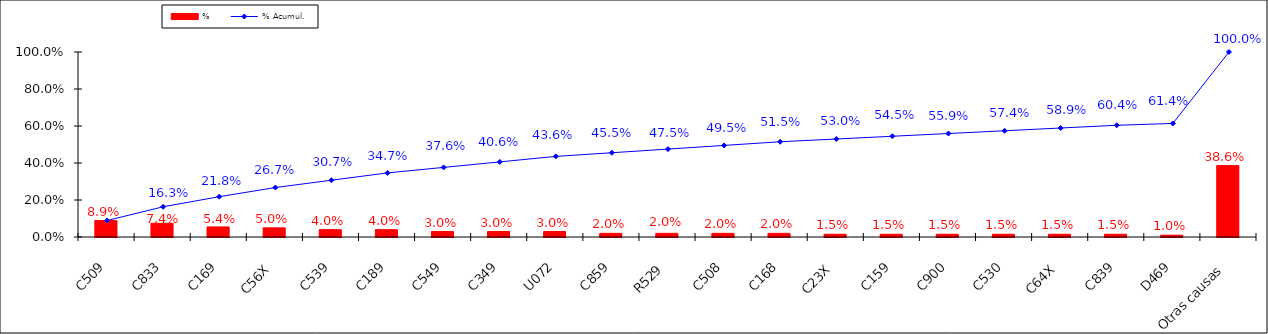
| Category | % |
|---|---|
| C509 | 0.089 |
| C833 | 0.074 |
| C169 | 0.054 |
| C56X | 0.05 |
| C539 | 0.04 |
| C189 | 0.04 |
| C549 | 0.03 |
| C349 | 0.03 |
| U072 | 0.03 |
| C859 | 0.02 |
| R529 | 0.02 |
| C508 | 0.02 |
| C168 | 0.02 |
| C23X | 0.015 |
| C159 | 0.015 |
| C900 | 0.015 |
| C530 | 0.015 |
| C64X | 0.015 |
| C839 | 0.015 |
| D469 | 0.01 |
| Otras causas | 0.386 |